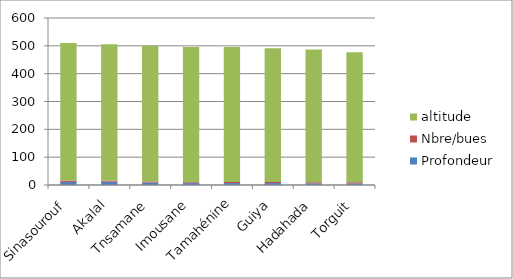
| Category | Profondeur | Nbre/bues | altitude |
|---|---|---|---|
| Sinasourouf | 11 | 5 | 494 |
| Akalal | 12 | 4 | 490 |
| Tnsamane | 9 | 4 | 487 |
| Imousane | 7 | 3 | 486 |
| Tamahénine | 7 | 4 | 485 |
| Guiya | 7 | 4 | 480 |
| Hadahada | 6 | 4 | 477 |
| Torguit | 6 | 4 | 467 |